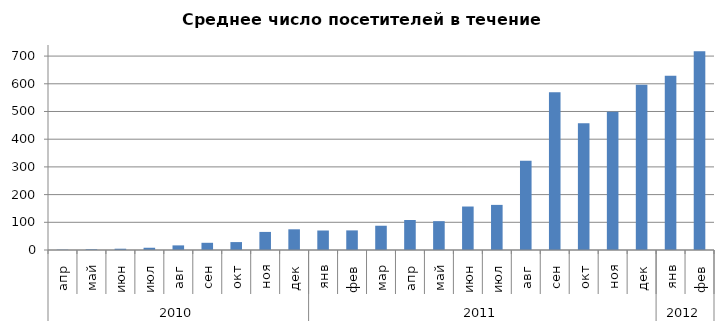
| Category | Series 0 |
|---|---|
| 0 | 1.211 |
| 1 | 2.537 |
| 2 | 4.634 |
| 3 | 8.111 |
| 4 | 16.667 |
| 5 | 26 |
| 6 | 28.581 |
| 7 | 65.267 |
| 8 | 74.71 |
| 9 | 70.387 |
| 10 | 70.786 |
| 11 | 87.581 |
| 12 | 108.367 |
| 13 | 104.097 |
| 14 | 156.967 |
| 15 | 162.839 |
| 16 | 322.387 |
| 17 | 569.467 |
| 18 | 457.258 |
| 19 | 498.867 |
| 20 | 596.387 |
| 21 | 629.129 |
| 22 | 717.655 |